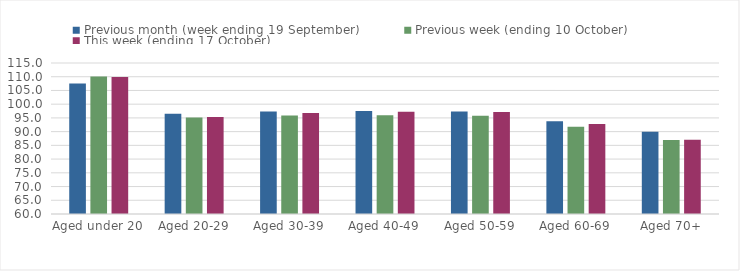
| Category | Previous month (week ending 19 September) | Previous week (ending 10 October) | This week (ending 17 October) |
|---|---|---|---|
| Aged under 20 | 107.56 | 110.12 | 109.88 |
| Aged 20-29 | 96.49 | 95.16 | 95.33 |
| Aged 30-39 | 97.37 | 95.91 | 96.75 |
| Aged 40-49 | 97.55 | 95.98 | 97.2 |
| Aged 50-59 | 97.29 | 95.81 | 97.14 |
| Aged 60-69 | 93.79 | 91.75 | 92.82 |
| Aged 70+ | 89.96 | 86.94 | 87.01 |